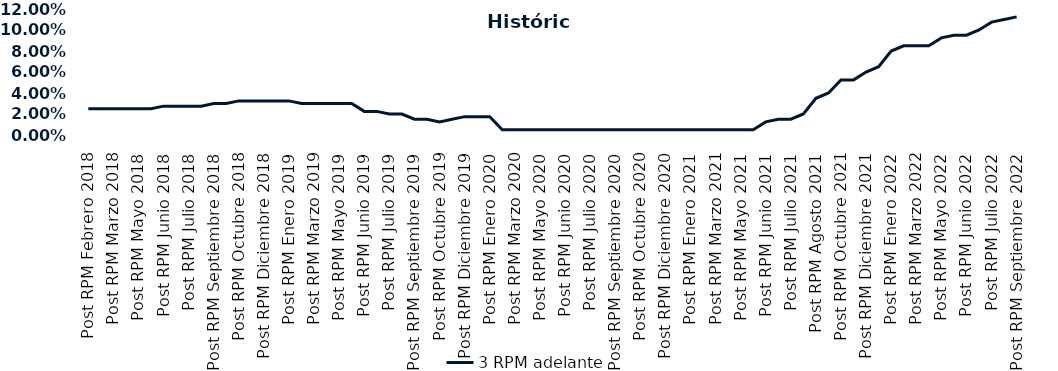
| Category | 3 RPM adelante |
|---|---|
| Post RPM Febrero 2018 | 0.025 |
| Pre RPM Marzo 2018 | 0.025 |
| Post RPM Marzo 2018 | 0.025 |
| Pre RPM Mayo 2018 | 0.025 |
| Post RPM Mayo 2018 | 0.025 |
| Pre RPM Junio 2018 | 0.025 |
| Post RPM Junio 2018 | 0.028 |
| Pre RPM Julio 2018 | 0.028 |
| Post RPM Julio 2018 | 0.028 |
| Pre RPM Septiembre 2018 | 0.028 |
| Post RPM Septiembre 2018 | 0.03 |
| Pre RPM Octubre 2018 | 0.03 |
| Post RPM Octubre 2018 | 0.032 |
| Pre RPM Diciembre 2018 | 0.032 |
| Post RPM Diciembre 2018 | 0.032 |
| Pre RPM Enero 2019 | 0.032 |
| Post RPM Enero 2019 | 0.032 |
| Pre RPM Marzo 2019 | 0.03 |
| Post RPM Marzo 2019 | 0.03 |
| Pre RPM Mayo 2019 | 0.03 |
| Post RPM Mayo 2019 | 0.03 |
| Pre RPM Junio 2019 | 0.03 |
| Post RPM Junio 2019 | 0.022 |
| Pre RPM Julio 2019 | 0.022 |
| Post RPM Julio 2019 | 0.02 |
| Pre RPM Septiembre 2019 | 0.02 |
| Post RPM Septiembre 2019 | 0.015 |
| Pre RPM Octubre 2019 | 0.015 |
| Post RPM Octubre 2019 | 0.012 |
| Pre RPM Diciembre 2019 | 0.015 |
| Post RPM Diciembre 2019 | 0.018 |
| Pre RPM Enero 2020 | 0.018 |
| Post RPM Enero 2020 | 0.018 |
| Pre RPM Marzo 2020 | 0.005 |
| Post RPM Marzo 2020 | 0.005 |
| Pre RPM Mayo 2020 | 0.005 |
| Post RPM Mayo 2020 | 0.005 |
| Pre RPM Junio 2020 | 0.005 |
| Post RPM Junio 2020 | 0.005 |
| Pre RPM Julio 2020 | 0.005 |
| Post RPM Julio 2020 | 0.005 |
| Pre RPM Septiembre 2020 | 0.005 |
| Post RPM Septiembre 2020 | 0.005 |
| Pre RPM Octubre 2020 | 0.005 |
| Post RPM Octubre 2020 | 0.005 |
| Pre RPM Diciembre 2020 | 0.005 |
| Post RPM Diciembre 2020 | 0.005 |
| Pre RPM Enero 2021 | 0.005 |
| Post RPM Enero 2021 | 0.005 |
| Pre RPM Marzo 2021 | 0.005 |
| Post RPM Marzo 2021 | 0.005 |
| Pre RPM Mayo 2021 | 0.005 |
| Post RPM Mayo 2021 | 0.005 |
| Pre RPM Junio 2021 | 0.005 |
| Post RPM Junio 2021 | 0.012 |
| Pre RPM Julio 2021 | 0.015 |
| Post RPM Julio 2021 | 0.015 |
| Pre RPM Agosto 2021 | 0.02 |
| Post RPM Agosto 2021 | 0.035 |
| Pre RPM Octubre 2021 | 0.04 |
| Post RPM Octubre 2021 | 0.052 |
| Pre RPM Diciembre 2021 | 0.052 |
| Post RPM Diciembre 2021 | 0.06 |
| Pre RPM Enero 2022 | 0.065 |
| Post RPM Enero 2022 | 0.08 |
| Pre RPM Marzo 2022 | 0.085 |
| Post RPM Marzo 2022 | 0.085 |
| Pre RPM Mayo 2022 | 0.085 |
| Post RPM Mayo 2022 | 0.092 |
| Pre RPM Junio 2022 | 0.095 |
| Post RPM Junio 2022 | 0.095 |
| Pre RPM Julio 2022 | 0.1 |
| Post RPM Julio 2022 | 0.108 |
| Pre RPM Septiembre 2022 | 0.11 |
| Post RPM Septiembre 2022 | 0.112 |